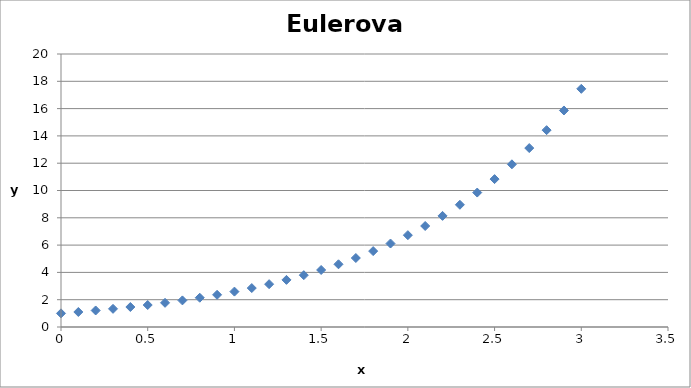
| Category | Series 0 |
|---|---|
| 0.0 | 1 |
| 0.1 | 1.1 |
| 0.2 | 1.21 |
| 0.3 | 1.331 |
| 0.4 | 1.464 |
| 0.5 | 1.611 |
| 0.6 | 1.772 |
| 0.7 | 1.949 |
| 0.8 | 2.144 |
| 0.9 | 2.358 |
| 1.0 | 2.594 |
| 1.1 | 2.853 |
| 1.2 | 3.138 |
| 1.3 | 3.452 |
| 1.4 | 3.797 |
| 1.5 | 4.177 |
| 1.6 | 4.595 |
| 1.7 | 5.054 |
| 1.8 | 5.56 |
| 1.9 | 6.116 |
| 2.0 | 6.727 |
| 2.1 | 7.4 |
| 2.2 | 8.14 |
| 2.3 | 8.954 |
| 2.4 | 9.85 |
| 2.5 | 10.835 |
| 2.6 | 11.918 |
| 2.7 | 13.11 |
| 2.8 | 14.421 |
| 2.9 | 15.863 |
| 3.0 | 17.449 |